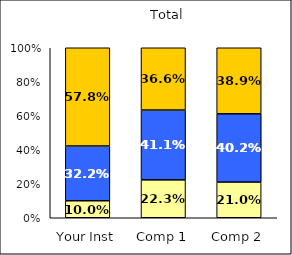
| Category | Low Social Self-Concept | Average Social Self-Concept | High Social Self-Concept |
|---|---|---|---|
| Your Inst | 0.1 | 0.322 | 0.578 |
| Comp 1 | 0.223 | 0.411 | 0.366 |
| Comp 2 | 0.21 | 0.402 | 0.389 |